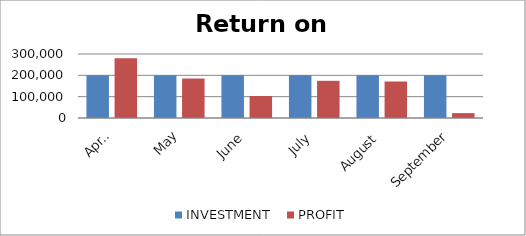
| Category | INVESTMENT  | PROFIT |
|---|---|---|
| April | 200000 | 280500 |
| May | 200000 | 185028 |
| June | 200000 | 103075 |
| July | 200000 | 174300 |
| August | 200000 | 171087 |
| September | 200000 | 22800 |